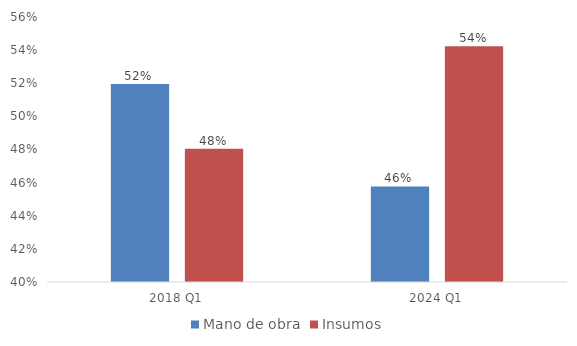
| Category | Mano de obra | Insumos |
|---|---|---|
| 2018 Q1 | 0.519 | 0.481 |
| 2024 Q1 | 0.458 | 0.542 |